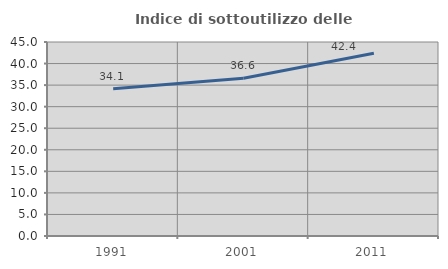
| Category | Indice di sottoutilizzo delle abitazioni  |
|---|---|
| 1991.0 | 34.141 |
| 2001.0 | 36.602 |
| 2011.0 | 42.39 |